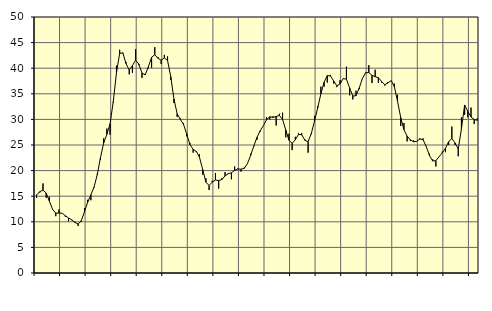
| Category | Piggar | Series 1 |
|---|---|---|
| nan | 14.7 | 15.26 |
| 87.0 | 15.7 | 15.89 |
| 87.0 | 17.5 | 16.18 |
| 87.0 | 14.7 | 15.63 |
| nan | 14.9 | 14.04 |
| 88.0 | 12.4 | 12.45 |
| 88.0 | 11.1 | 11.7 |
| 88.0 | 12.4 | 11.7 |
| nan | 11.7 | 11.68 |
| 89.0 | 11 | 11.19 |
| 89.0 | 10.1 | 10.74 |
| 89.0 | 10.3 | 10.4 |
| nan | 10 | 9.87 |
| 90.0 | 9.2 | 9.56 |
| 90.0 | 10 | 10.23 |
| 90.0 | 12.7 | 11.95 |
| nan | 14.3 | 13.85 |
| 91.0 | 14.2 | 15.28 |
| 91.0 | 16.7 | 16.81 |
| 91.0 | 19.4 | 19.22 |
| nan | 22.1 | 22.54 |
| 92.0 | 26.3 | 25.41 |
| 92.0 | 28.2 | 27.08 |
| 92.0 | 27 | 29.15 |
| nan | 33.3 | 33.45 |
| 93.0 | 40.5 | 39.08 |
| 93.0 | 43.6 | 42.88 |
| 93.0 | 42.9 | 43.01 |
| nan | 41.2 | 40.9 |
| 94.0 | 38.8 | 39.64 |
| 94.0 | 39.1 | 40.51 |
| 94.0 | 43.7 | 41.57 |
| nan | 40.6 | 40.79 |
| 95.0 | 38.1 | 39.05 |
| 95.0 | 38.9 | 38.7 |
| 95.0 | 40 | 40.28 |
| nan | 40.1 | 42.14 |
| 96.0 | 44.1 | 42.63 |
| 96.0 | 42.2 | 41.93 |
| 96.0 | 40.8 | 41.55 |
| nan | 42.6 | 42.02 |
| 97.0 | 42.3 | 41.51 |
| 97.0 | 37.7 | 38.35 |
| 97.0 | 33.2 | 33.99 |
| nan | 30.5 | 31.1 |
| 98.0 | 30.2 | 30.02 |
| 98.0 | 29.3 | 29 |
| 98.0 | 26.7 | 27.15 |
| nan | 25.4 | 25.08 |
| 99.0 | 23.5 | 24.16 |
| 99.0 | 23.6 | 23.77 |
| 99.0 | 23.2 | 22.59 |
| nan | 19.2 | 20.22 |
| 0.0 | 18.5 | 17.75 |
| 0.0 | 16.2 | 17.09 |
| 0.0 | 18 | 17.75 |
| nan | 19.5 | 18.16 |
| 1.0 | 16.5 | 18.06 |
| 1.0 | 18.5 | 18.25 |
| 1.0 | 19.7 | 18.97 |
| nan | 19.5 | 19.39 |
| 2.0 | 18.3 | 19.58 |
| 2.0 | 20.8 | 20.05 |
| 2.0 | 20.4 | 20.32 |
| nan | 19.8 | 20.27 |
| 3.0 | 20.6 | 20.44 |
| 3.0 | 21.3 | 21.36 |
| 3.0 | 23.3 | 22.95 |
| nan | 24.7 | 24.79 |
| 4.0 | 26 | 26.51 |
| 4.0 | 27.6 | 27.78 |
| 4.0 | 28.8 | 28.79 |
| nan | 30.4 | 29.95 |
| 5.0 | 30 | 30.51 |
| 5.0 | 30.6 | 30.4 |
| 5.0 | 28.8 | 30.56 |
| nan | 31.1 | 30.78 |
| 6.0 | 31.3 | 30 |
| 6.0 | 26.5 | 27.95 |
| 6.0 | 27.2 | 25.94 |
| nan | 24 | 25.32 |
| 7.0 | 26.6 | 26.03 |
| 7.0 | 27.3 | 27.07 |
| 7.0 | 27.3 | 27 |
| nan | 26.1 | 25.91 |
| 8.0 | 23.5 | 25.67 |
| 8.0 | 27.1 | 27.23 |
| 8.0 | 30.7 | 29.65 |
| nan | 32.6 | 32.25 |
| 9.0 | 36.4 | 35 |
| 9.0 | 36.4 | 37.24 |
| 9.0 | 37.2 | 38.56 |
| nan | 38.7 | 38.49 |
| 10.0 | 37 | 37.52 |
| 10.0 | 36.3 | 36.58 |
| 10.0 | 37.7 | 36.91 |
| nan | 38 | 37.97 |
| 11.0 | 40.3 | 37.85 |
| 11.0 | 34.7 | 36.15 |
| 11.0 | 33.9 | 34.56 |
| nan | 35.6 | 34.64 |
| 12.0 | 35.9 | 36.13 |
| 12.0 | 37.9 | 37.99 |
| 12.0 | 39.2 | 39.1 |
| nan | 40.6 | 39.16 |
| 13.0 | 37.1 | 38.61 |
| 13.0 | 39.7 | 38.34 |
| 13.0 | 37.1 | 38.14 |
| nan | 37.2 | 37.4 |
| 14.0 | 36.6 | 36.79 |
| 14.0 | 37.3 | 37.11 |
| 14.0 | 37.6 | 37.6 |
| nan | 37 | 36.39 |
| 15.0 | 34.8 | 33.53 |
| 15.0 | 28.7 | 30.34 |
| 15.0 | 29.3 | 28.01 |
| nan | 25.7 | 26.72 |
| 16.0 | 25.8 | 26 |
| 16.0 | 25.9 | 25.64 |
| 16.0 | 25.7 | 25.72 |
| nan | 26.3 | 26.17 |
| 17.0 | 26.3 | 26.02 |
| 17.0 | 24.6 | 24.67 |
| 17.0 | 23.3 | 22.93 |
| nan | 22.2 | 21.87 |
| 18.0 | 20.8 | 21.94 |
| 18.0 | 22.7 | 22.72 |
| 18.0 | 23.7 | 23.46 |
| nan | 23.6 | 24.36 |
| 19.0 | 25 | 25.66 |
| 19.0 | 28.6 | 26.26 |
| 19.0 | 25 | 25.41 |
| nan | 22.8 | 24.2 |
| 20.0 | 30.4 | 28.16 |
| 20.0 | 30.9 | 32.82 |
| 20.0 | 30.4 | 31.58 |
| nan | 32.3 | 30.48 |
| 21.0 | 29.1 | 29.97 |
| 21.0 | 30.2 | 29.82 |